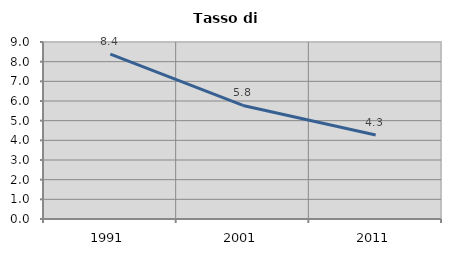
| Category | Tasso di disoccupazione   |
|---|---|
| 1991.0 | 8.379 |
| 2001.0 | 5.772 |
| 2011.0 | 4.271 |